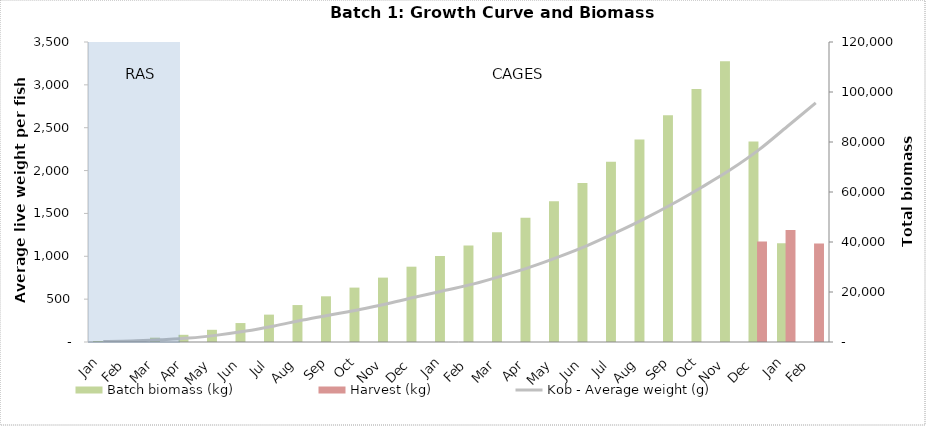
| Category | Batch biomass (kg) | Harvest (kg) |
|---|---|---|
| Jan | 386.214 | 0 |
| Feb | 774.599 | 0 |
| Mar | 1727.413 | 0 |
| Apr | 2876.194 | 0 |
| May | 4877.664 | 0 |
| Jun | 7582.446 | 0 |
| Jul | 10947.557 | 0 |
| Aug | 14777.567 | 0 |
| Sep | 18282.157 | 0 |
| Oct | 21761.054 | 0 |
| Nov | 25755.144 | 0 |
| Dec | 30122.001 | 0 |
| Jan | 34375.648 | 0 |
| Feb | 38586.761 | 0 |
| Mar | 43862.78 | 0 |
| Apr | 49652.296 | 0 |
| May | 56330.35 | 0 |
| Jun | 63642.858 | 0 |
| Jul | 72060.625 | 0 |
| Aug | 80989.362 | 0 |
| Sep | 90676.224 | 0 |
| Oct | 101158.924 | 0 |
| Nov | 112259.747 | 0 |
| Dec | 80200.522 | 40164.577 |